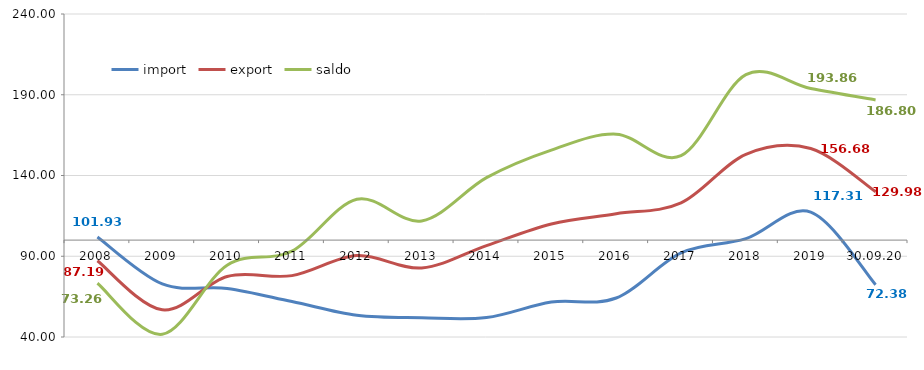
| Category | import | export | saldo |
|---|---|---|---|
| 2008 | 101.934 | 87.189 | 73.264 |
| 2009 | 72.88 | 56.839 | 41.69 |
| 2010 | 70.067 | 77.48 | 84.48 |
| 2011 | 61.95 | 78.007 | 93.17 |
| 2012 | 53.428 | 90.391 | 125.297 |
| 2013 | 51.912 | 82.755 | 111.881 |
| 2014 | 52.037 | 96.582 | 138.647 |
| 2015 | 61.613 | 110.014 | 155.72 |
| 2016 | 64.146 | 116.327 | 165.602 |
| 2017 | 92.112 | 123.043 | 152.251 |
| 2018 | 100.929 | 153.149 | 202.462 |
| 2019 | 117.314 | 156.681 | 193.855 |
| 30.09.20 | 72.383 | 129.982 | 186.802 |